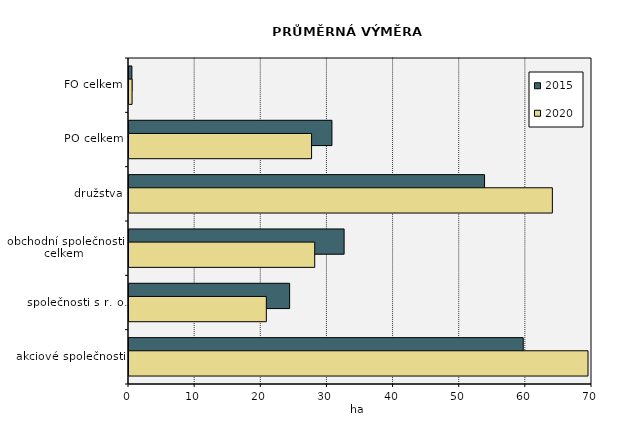
| Category | 2015 | 2020 |
|---|---|---|
| FO celkem | 0.438 | 0.468 |
| PO celkem | 30.681 | 27.602 |
| družstva | 53.755 | 64.009 |
| obchodní společnosti
celkem | 32.523 | 28.078 |
| společnosti s r. o. | 24.283 | 20.763 |
| akciové společnosti | 59.603 | 69.398 |